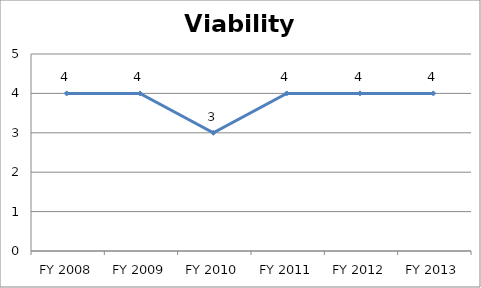
| Category | Viability score |
|---|---|
| FY 2013 | 4 |
| FY 2012 | 4 |
| FY 2011 | 4 |
| FY 2010 | 3 |
| FY 2009 | 4 |
| FY 2008 | 4 |